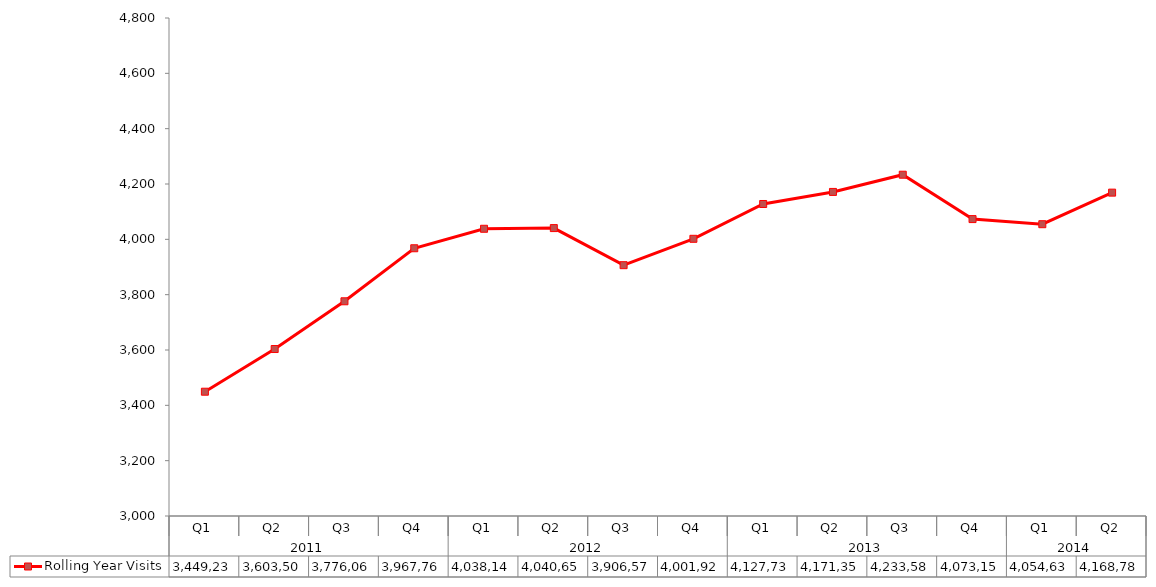
| Category | Rolling Year Visits  |
|---|---|
| 0 | 3449234 |
| 1 | 3603503 |
| 2 | 3776061 |
| 3 | 3967760 |
| 4 | 4038147 |
| 5 | 4040657 |
| 6 | 3906570 |
| 7 | 4001929 |
| 8 | 4127736 |
| 9 | 4171351 |
| 10 | 4233584 |
| 11 | 4073157 |
| 12 | 4054633 |
| 13 | 4168783 |